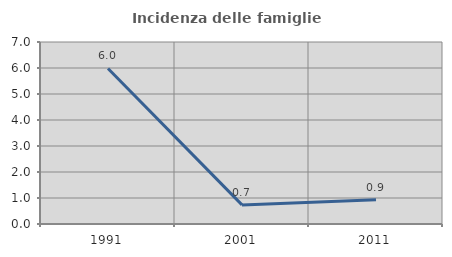
| Category | Incidenza delle famiglie numerose |
|---|---|
| 1991.0 | 5.983 |
| 2001.0 | 0.735 |
| 2011.0 | 0.935 |